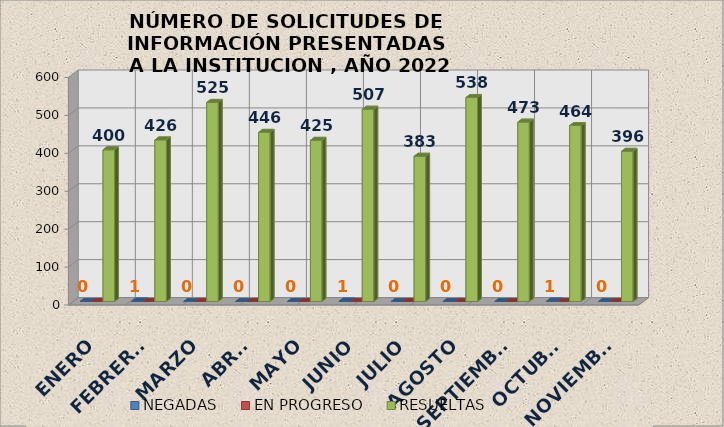
| Category | NEGADAS | EN PROGRESO | RESUELTAS |
|---|---|---|---|
| ENERO | 0 | 0 | 400 |
| FEBRERO | 1 | 0 | 426 |
| MARZO | 0 | 0 | 525 |
| ABRIL | 0 | 0 | 446 |
| MAYO | 0 | 0 | 425 |
| JUNIO | 1 | 0 | 507 |
| JULIO | 0 | 0 | 383 |
| AGOSTO | 0 | 0 | 538 |
| SEPTIEMBRE | 0 | 0 | 473 |
| OCTUBRE | 1 | 0 | 464 |
| NOVIEMBRE | 0 | 0 | 396 |